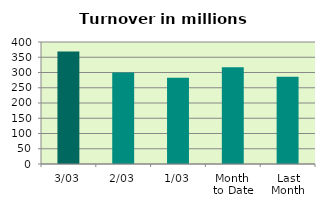
| Category | Series 0 |
|---|---|
| 3/03 | 368.702 |
| 2/03 | 300.076 |
| 1/03 | 282.644 |
| Month 
to Date | 317.141 |
| Last
Month | 285.972 |